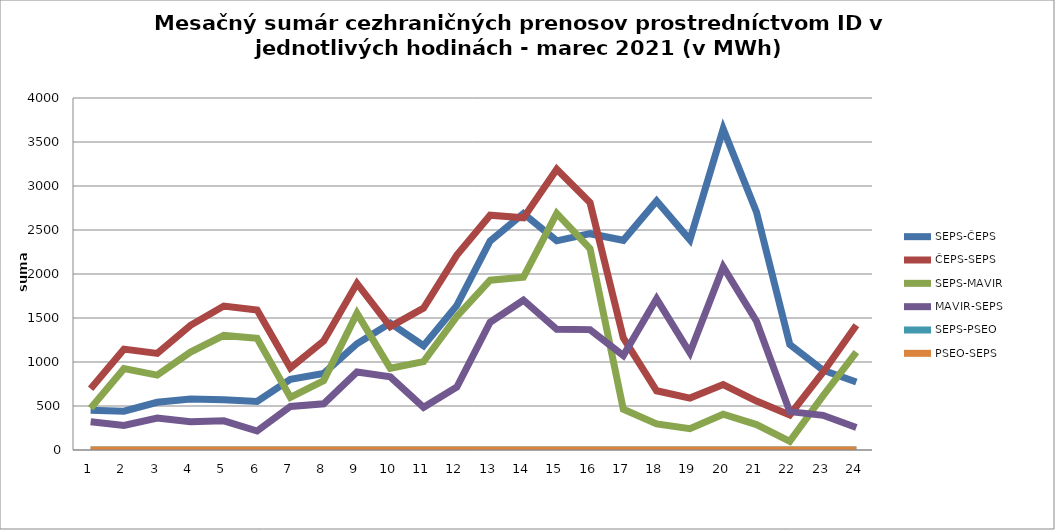
| Category | SEPS-ČEPS | ČEPS-SEPS | SEPS-MAVIR | MAVIR-SEPS | SEPS-PSEO | PSEO-SEPS |
|---|---|---|---|---|---|---|
| 1.0 | 452 | 696 | 475 | 322 | 0 | 0 |
| 2.0 | 441 | 1146 | 924 | 278 | 0 | 0 |
| 3.0 | 542 | 1098 | 851 | 364 | 0 | 0 |
| 4.0 | 580 | 1417 | 1113 | 322 | 0 | 0 |
| 5.0 | 570 | 1636 | 1302 | 331 | 0 | 0 |
| 6.0 | 552 | 1591 | 1270 | 216 | 0 | 0 |
| 7.0 | 802 | 933 | 597 | 494 | 0 | 0 |
| 8.0 | 870 | 1239 | 789 | 525 | 0 | 0 |
| 9.0 | 1208 | 1893 | 1553 | 886 | 0 | 0 |
| 10.0 | 1442 | 1402 | 929 | 831 | 0 | 0 |
| 11.0 | 1185 | 1612 | 1005 | 485 | 0 | 0 |
| 12.0 | 1643 | 2215 | 1518 | 716 | 0 | 0 |
| 13.0 | 2375 | 2668 | 1930 | 1452 | 0 | 0 |
| 14.0 | 2686 | 2638 | 1964 | 1702 | 0 | 0 |
| 15.0 | 2377 | 3191 | 2689 | 1372 | 0 | 0 |
| 16.0 | 2458 | 2811 | 2289 | 1368 | 0 | 0 |
| 17.0 | 2383 | 1274 | 464 | 1073 | 0 | 0 |
| 18.0 | 2831 | 673 | 297 | 1718 | 0 | 0 |
| 19.0 | 2388 | 590 | 242 | 1105 | 0 | 0 |
| 20.0 | 3649 | 743 | 407 | 2080 | 0 | 0 |
| 21.0 | 2705 | 556 | 289 | 1464 | 0 | 0 |
| 22.0 | 1200 | 398 | 98 | 436 | 0 | 0 |
| 23.0 | 907 | 884 | 617 | 394 | 0 | 0 |
| 24.0 | 772 | 1417 | 1113 | 255 | 0 | 0 |